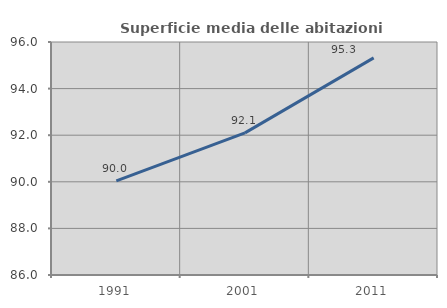
| Category | Superficie media delle abitazioni occupate |
|---|---|
| 1991.0 | 90.04 |
| 2001.0 | 92.101 |
| 2011.0 | 95.319 |